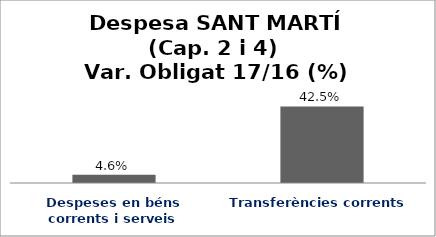
| Category | Series 0 |
|---|---|
| Despeses en béns corrents i serveis | 0.046 |
| Transferències corrents | 0.425 |